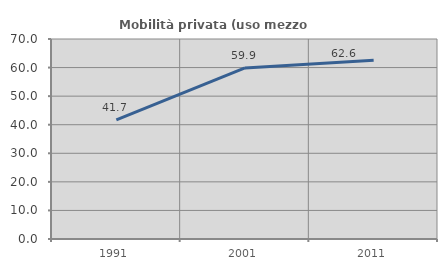
| Category | Mobilità privata (uso mezzo privato) |
|---|---|
| 1991.0 | 41.682 |
| 2001.0 | 59.884 |
| 2011.0 | 62.581 |